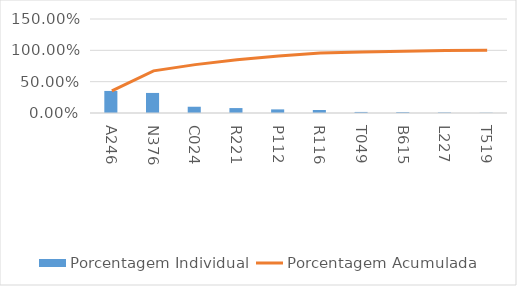
| Category | Porcentagem Individual |
|---|---|
| A246 | 0.352 |
| N376 | 0.32 |
| C024 | 0.1 |
| R221 | 0.079 |
| P112 | 0.058 |
| R116 | 0.048 |
| T049 | 0.017 |
| B615 | 0.014 |
| L227 | 0.009 |
| T519 | 0.004 |